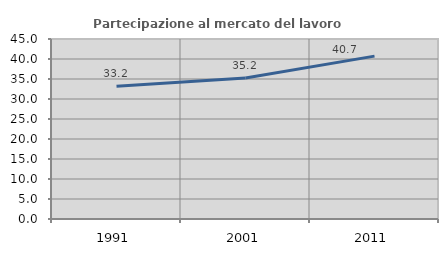
| Category | Partecipazione al mercato del lavoro  femminile |
|---|---|
| 1991.0 | 33.193 |
| 2001.0 | 35.234 |
| 2011.0 | 40.724 |